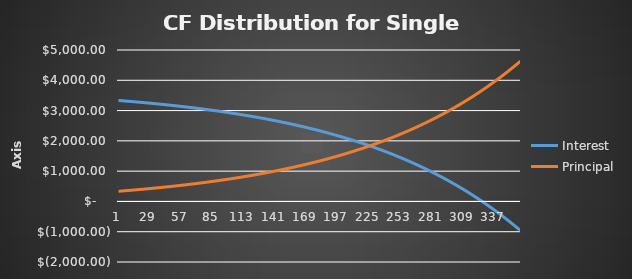
| Category | Interest | Principal |
|---|---|---|
| 0 | 3333.333 | 335.49 |
| 1 | 3330.43 | 338.393 |
| 2 | 3327.507 | 341.315 |
| 3 | 3324.565 | 344.258 |
| 4 | 3321.604 | 347.219 |
| 5 | 3318.622 | 350.201 |
| 6 | 3315.621 | 353.202 |
| 7 | 3312.599 | 356.223 |
| 8 | 3309.558 | 359.265 |
| 9 | 3306.496 | 362.327 |
| 10 | 3303.414 | 365.409 |
| 11 | 3300.311 | 368.512 |
| 12 | 3297.188 | 371.635 |
| 13 | 3294.044 | 374.779 |
| 14 | 3290.878 | 377.944 |
| 15 | 3287.692 | 381.131 |
| 16 | 3284.485 | 384.338 |
| 17 | 3281.256 | 387.567 |
| 18 | 3278.005 | 390.818 |
| 19 | 3274.733 | 394.09 |
| 20 | 3271.439 | 397.384 |
| 21 | 3268.123 | 400.7 |
| 22 | 3264.785 | 404.038 |
| 23 | 3261.425 | 407.398 |
| 24 | 3258.042 | 410.78 |
| 25 | 3254.637 | 414.186 |
| 26 | 3251.209 | 417.614 |
| 27 | 3247.759 | 421.064 |
| 28 | 3244.285 | 424.538 |
| 29 | 3240.788 | 428.035 |
| 30 | 3237.268 | 431.555 |
| 31 | 3233.724 | 435.099 |
| 32 | 3230.157 | 438.666 |
| 33 | 3226.566 | 442.257 |
| 34 | 3222.95 | 445.872 |
| 35 | 3219.311 | 449.512 |
| 36 | 3215.648 | 453.175 |
| 37 | 3211.96 | 456.863 |
| 38 | 3208.248 | 460.575 |
| 39 | 3204.511 | 464.312 |
| 40 | 3200.748 | 468.074 |
| 41 | 3196.961 | 471.862 |
| 42 | 3193.149 | 475.674 |
| 43 | 3189.311 | 479.512 |
| 44 | 3185.448 | 483.375 |
| 45 | 3181.558 | 487.264 |
| 46 | 3177.643 | 491.18 |
| 47 | 3173.702 | 495.121 |
| 48 | 3169.735 | 499.088 |
| 49 | 3165.741 | 503.082 |
| 50 | 3161.72 | 507.103 |
| 51 | 3157.673 | 511.15 |
| 52 | 3153.599 | 515.224 |
| 53 | 3149.497 | 519.326 |
| 54 | 3145.368 | 523.455 |
| 55 | 3141.212 | 527.611 |
| 56 | 3137.028 | 531.795 |
| 57 | 3132.816 | 536.007 |
| 58 | 3128.576 | 540.247 |
| 59 | 3124.307 | 544.515 |
| 60 | 3120.011 | 548.812 |
| 61 | 3115.685 | 553.138 |
| 62 | 3111.331 | 557.492 |
| 63 | 3106.948 | 561.875 |
| 64 | 3102.535 | 566.288 |
| 65 | 3098.093 | 570.73 |
| 66 | 3093.622 | 575.201 |
| 67 | 3089.12 | 579.702 |
| 68 | 3084.589 | 584.234 |
| 69 | 3080.028 | 588.795 |
| 70 | 3075.436 | 593.387 |
| 71 | 3070.813 | 598.01 |
| 72 | 3066.16 | 602.663 |
| 73 | 3061.475 | 607.348 |
| 74 | 3056.759 | 612.063 |
| 75 | 3052.012 | 616.81 |
| 76 | 3047.234 | 621.589 |
| 77 | 3042.423 | 626.4 |
| 78 | 3037.58 | 631.242 |
| 79 | 3032.705 | 636.117 |
| 80 | 3027.798 | 641.025 |
| 81 | 3022.858 | 645.965 |
| 82 | 3017.885 | 650.938 |
| 83 | 3012.878 | 655.944 |
| 84 | 3007.839 | 660.984 |
| 85 | 3002.766 | 666.057 |
| 86 | 2997.659 | 671.164 |
| 87 | 2992.517 | 676.305 |
| 88 | 2987.342 | 681.481 |
| 89 | 2982.132 | 686.691 |
| 90 | 2976.888 | 691.935 |
| 91 | 2971.608 | 697.215 |
| 92 | 2966.293 | 702.53 |
| 93 | 2960.943 | 707.88 |
| 94 | 2955.557 | 713.266 |
| 95 | 2950.135 | 718.687 |
| 96 | 2944.678 | 724.145 |
| 97 | 2939.183 | 729.64 |
| 98 | 2933.652 | 735.171 |
| 99 | 2928.085 | 740.738 |
| 100 | 2922.48 | 746.343 |
| 101 | 2916.837 | 751.986 |
| 102 | 2911.157 | 757.665 |
| 103 | 2905.44 | 763.383 |
| 104 | 2899.684 | 769.139 |
| 105 | 2893.889 | 774.933 |
| 106 | 2888.057 | 780.766 |
| 107 | 2882.185 | 786.638 |
| 108 | 2876.274 | 792.549 |
| 109 | 2870.324 | 798.499 |
| 110 | 2864.334 | 804.489 |
| 111 | 2858.304 | 810.519 |
| 112 | 2852.234 | 816.589 |
| 113 | 2846.123 | 822.7 |
| 114 | 2839.972 | 828.851 |
| 115 | 2833.779 | 835.044 |
| 116 | 2827.546 | 841.277 |
| 117 | 2821.27 | 847.552 |
| 118 | 2814.953 | 853.869 |
| 119 | 2808.594 | 860.229 |
| 120 | 2802.193 | 866.63 |
| 121 | 2795.749 | 873.074 |
| 122 | 2789.261 | 879.561 |
| 123 | 2782.731 | 886.092 |
| 124 | 2776.157 | 892.666 |
| 125 | 2769.539 | 899.284 |
| 126 | 2762.877 | 905.945 |
| 127 | 2756.171 | 912.652 |
| 128 | 2749.42 | 919.403 |
| 129 | 2742.624 | 926.199 |
| 130 | 2735.783 | 933.04 |
| 131 | 2728.896 | 939.927 |
| 132 | 2721.963 | 946.86 |
| 133 | 2714.984 | 953.839 |
| 134 | 2707.958 | 960.865 |
| 135 | 2700.886 | 967.937 |
| 136 | 2693.766 | 975.057 |
| 137 | 2686.599 | 982.224 |
| 138 | 2679.384 | 989.438 |
| 139 | 2672.121 | 996.701 |
| 140 | 2664.81 | 1004.013 |
| 141 | 2657.45 | 1011.373 |
| 142 | 2650.041 | 1018.782 |
| 143 | 2642.582 | 1026.241 |
| 144 | 2635.074 | 1033.749 |
| 145 | 2627.516 | 1041.307 |
| 146 | 2619.907 | 1048.916 |
| 147 | 2612.248 | 1056.575 |
| 148 | 2604.537 | 1064.286 |
| 149 | 2596.775 | 1072.048 |
| 150 | 2588.962 | 1079.861 |
| 151 | 2581.096 | 1087.727 |
| 152 | 2573.178 | 1095.645 |
| 153 | 2565.207 | 1103.616 |
| 154 | 2557.183 | 1111.64 |
| 155 | 2549.105 | 1119.718 |
| 156 | 2540.974 | 1127.849 |
| 157 | 2532.788 | 1136.035 |
| 158 | 2524.548 | 1144.275 |
| 159 | 2516.252 | 1152.57 |
| 160 | 2507.902 | 1160.921 |
| 161 | 2499.496 | 1169.327 |
| 162 | 2491.034 | 1177.789 |
| 163 | 2482.515 | 1186.308 |
| 164 | 2473.94 | 1194.883 |
| 165 | 2465.307 | 1203.516 |
| 166 | 2456.617 | 1212.206 |
| 167 | 2447.869 | 1220.954 |
| 168 | 2439.063 | 1229.76 |
| 169 | 2430.198 | 1238.625 |
| 170 | 2421.273 | 1247.549 |
| 171 | 2412.29 | 1256.533 |
| 172 | 2403.246 | 1265.577 |
| 173 | 2394.142 | 1274.681 |
| 174 | 2384.978 | 1283.845 |
| 175 | 2375.752 | 1293.071 |
| 176 | 2366.465 | 1302.358 |
| 177 | 2357.116 | 1311.707 |
| 178 | 2347.705 | 1321.118 |
| 179 | 2338.23 | 1330.592 |
| 180 | 2328.693 | 1340.13 |
| 181 | 2319.092 | 1349.731 |
| 182 | 2309.427 | 1359.395 |
| 183 | 2299.698 | 1369.125 |
| 184 | 2289.904 | 1378.919 |
| 185 | 2280.045 | 1388.778 |
| 186 | 2270.119 | 1398.704 |
| 187 | 2260.128 | 1408.695 |
| 188 | 2250.07 | 1418.753 |
| 189 | 2239.945 | 1428.878 |
| 190 | 2229.752 | 1439.07 |
| 191 | 2219.492 | 1449.331 |
| 192 | 2209.163 | 1459.66 |
| 193 | 2198.765 | 1470.057 |
| 194 | 2188.298 | 1480.525 |
| 195 | 2177.762 | 1491.061 |
| 196 | 2167.154 | 1501.668 |
| 197 | 2156.477 | 1512.346 |
| 198 | 2145.728 | 1523.095 |
| 199 | 2134.907 | 1533.916 |
| 200 | 2124.014 | 1544.809 |
| 201 | 2113.049 | 1555.774 |
| 202 | 2102.01 | 1566.812 |
| 203 | 2090.898 | 1577.925 |
| 204 | 2079.712 | 1589.111 |
| 205 | 2068.451 | 1600.371 |
| 206 | 2057.116 | 1611.707 |
| 207 | 2045.704 | 1623.119 |
| 208 | 2034.217 | 1634.606 |
| 209 | 2022.653 | 1646.17 |
| 210 | 2011.012 | 1657.811 |
| 211 | 1999.293 | 1669.53 |
| 212 | 1987.496 | 1681.327 |
| 213 | 1975.62 | 1693.202 |
| 214 | 1963.666 | 1705.157 |
| 215 | 1951.631 | 1717.191 |
| 216 | 1939.517 | 1729.306 |
| 217 | 1927.321 | 1741.501 |
| 218 | 1915.045 | 1753.778 |
| 219 | 1902.686 | 1766.137 |
| 220 | 1890.245 | 1778.578 |
| 221 | 1877.721 | 1791.101 |
| 222 | 1865.114 | 1803.709 |
| 223 | 1852.423 | 1816.4 |
| 224 | 1839.647 | 1829.176 |
| 225 | 1826.786 | 1842.037 |
| 226 | 1813.839 | 1854.984 |
| 227 | 1800.805 | 1868.017 |
| 228 | 1787.685 | 1881.138 |
| 229 | 1774.478 | 1894.345 |
| 230 | 1761.182 | 1907.641 |
| 231 | 1747.798 | 1921.025 |
| 232 | 1734.324 | 1934.499 |
| 233 | 1720.761 | 1948.062 |
| 234 | 1707.107 | 1961.716 |
| 235 | 1693.362 | 1975.46 |
| 236 | 1679.526 | 1989.297 |
| 237 | 1665.597 | 2003.225 |
| 238 | 1651.576 | 2017.247 |
| 239 | 1637.461 | 2031.362 |
| 240 | 1623.252 | 2045.571 |
| 241 | 1608.948 | 2059.875 |
| 242 | 1594.549 | 2074.274 |
| 243 | 1580.054 | 2088.769 |
| 244 | 1565.462 | 2103.361 |
| 245 | 1550.773 | 2118.05 |
| 246 | 1535.986 | 2132.837 |
| 247 | 1521.1 | 2147.723 |
| 248 | 1506.115 | 2162.707 |
| 249 | 1491.031 | 2177.792 |
| 250 | 1475.845 | 2192.977 |
| 251 | 1460.559 | 2208.264 |
| 252 | 1445.17 | 2223.652 |
| 253 | 1429.679 | 2239.143 |
| 254 | 1414.085 | 2254.738 |
| 255 | 1398.387 | 2270.436 |
| 256 | 1382.584 | 2286.239 |
| 257 | 1366.676 | 2302.147 |
| 258 | 1350.661 | 2318.161 |
| 259 | 1334.54 | 2334.283 |
| 260 | 1318.312 | 2350.511 |
| 261 | 1301.975 | 2366.848 |
| 262 | 1285.529 | 2383.293 |
| 263 | 1268.974 | 2399.849 |
| 264 | 1252.308 | 2416.514 |
| 265 | 1235.532 | 2433.291 |
| 266 | 1218.643 | 2450.18 |
| 267 | 1201.642 | 2467.181 |
| 268 | 1184.527 | 2484.296 |
| 269 | 1167.299 | 2501.524 |
| 270 | 1149.955 | 2518.868 |
| 271 | 1132.496 | 2536.327 |
| 272 | 1114.921 | 2553.902 |
| 273 | 1097.228 | 2571.595 |
| 274 | 1079.417 | 2589.406 |
| 275 | 1061.488 | 2607.335 |
| 276 | 1043.439 | 2625.384 |
| 277 | 1025.27 | 2643.553 |
| 278 | 1006.979 | 2661.843 |
| 279 | 988.567 | 2680.256 |
| 280 | 970.032 | 2698.791 |
| 281 | 951.374 | 2717.449 |
| 282 | 932.591 | 2736.232 |
| 283 | 913.682 | 2755.141 |
| 284 | 894.648 | 2774.175 |
| 285 | 875.487 | 2793.336 |
| 286 | 856.198 | 2812.625 |
| 287 | 836.78 | 2832.042 |
| 288 | 817.234 | 2851.589 |
| 289 | 797.556 | 2871.267 |
| 290 | 777.748 | 2891.075 |
| 291 | 757.807 | 2911.016 |
| 292 | 737.734 | 2931.089 |
| 293 | 717.527 | 2951.296 |
| 294 | 697.185 | 2971.638 |
| 295 | 676.707 | 2992.116 |
| 296 | 656.093 | 3012.73 |
| 297 | 635.341 | 3033.481 |
| 298 | 614.452 | 3054.371 |
| 299 | 593.422 | 3075.4 |
| 300 | 572.253 | 3096.57 |
| 301 | 550.943 | 3117.88 |
| 302 | 529.49 | 3139.333 |
| 303 | 507.894 | 3160.928 |
| 304 | 486.155 | 3182.668 |
| 305 | 464.271 | 3204.552 |
| 306 | 442.24 | 3226.583 |
| 307 | 420.063 | 3248.76 |
| 308 | 397.738 | 3271.085 |
| 309 | 375.264 | 3293.559 |
| 310 | 352.64 | 3316.183 |
| 311 | 329.866 | 3338.957 |
| 312 | 306.939 | 3361.884 |
| 313 | 283.86 | 3384.963 |
| 314 | 260.627 | 3408.196 |
| 315 | 237.239 | 3431.584 |
| 316 | 213.695 | 3455.128 |
| 317 | 189.994 | 3478.829 |
| 318 | 166.135 | 3502.687 |
| 319 | 142.118 | 3526.705 |
| 320 | 117.939 | 3550.883 |
| 321 | 93.6 | 3575.223 |
| 322 | 69.099 | 3599.724 |
| 323 | 44.434 | 3624.389 |
| 324 | 19.605 | 3649.218 |
| 325 | -5.39 | 3674.213 |
| 326 | -30.552 | 3699.374 |
| 327 | -55.881 | 3724.704 |
| 328 | -81.379 | 3750.202 |
| 329 | -107.047 | 3775.87 |
| 330 | -132.886 | 3801.709 |
| 331 | -158.897 | 3827.72 |
| 332 | -185.082 | 3853.905 |
| 333 | -211.441 | 3880.264 |
| 334 | -237.976 | 3906.799 |
| 335 | -264.688 | 3933.511 |
| 336 | -291.579 | 3960.401 |
| 337 | -318.648 | 3987.471 |
| 338 | -345.898 | 4014.721 |
| 339 | -373.329 | 4042.152 |
| 340 | -400.944 | 4069.766 |
| 341 | -428.742 | 4097.565 |
| 342 | -456.726 | 4125.549 |
| 343 | -484.896 | 4153.719 |
| 344 | -513.254 | 4182.077 |
| 345 | -541.801 | 4210.624 |
| 346 | -570.539 | 4239.362 |
| 347 | -599.468 | 4268.291 |
| 348 | -628.59 | 4297.413 |
| 349 | -657.906 | 4326.729 |
| 350 | -687.417 | 4356.24 |
| 351 | -717.126 | 4385.949 |
| 352 | -747.032 | 4415.855 |
| 353 | -777.138 | 4445.961 |
| 354 | -807.444 | 4476.267 |
| 355 | -837.953 | 4506.776 |
| 356 | -868.664 | 4537.487 |
| 357 | -899.581 | 4568.404 |
| 358 | -930.704 | 4599.527 |
| 359 | -962.034 | 4630.857 |